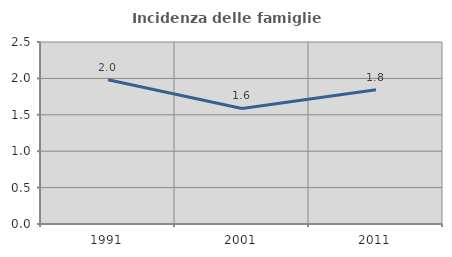
| Category | Incidenza delle famiglie numerose |
|---|---|
| 1991.0 | 1.98 |
| 2001.0 | 1.587 |
| 2011.0 | 1.845 |